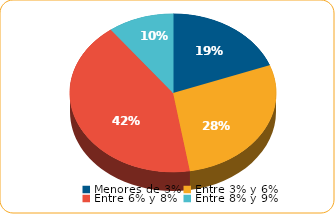
| Category | Series 0 |
|---|---|
| Menores de 3% | 2511 |
| Entre 3% y 6% | 3655 |
| Entre 6% y 8% | 5506.1 |
| Entre 8% y 9% | 1337.8 |